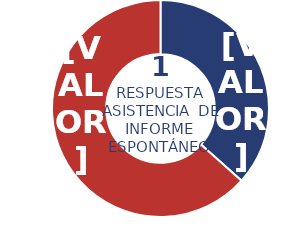
| Category | Series 0 |
|---|---|
| Física | 15 |
| Jurídica | 26 |